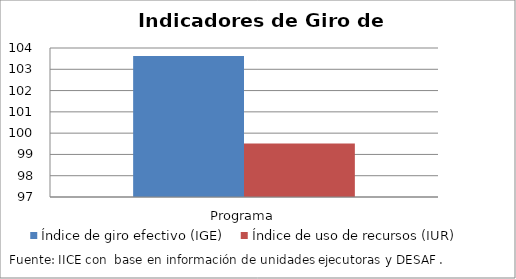
| Category | Índice de giro efectivo (IGE) | Índice de uso de recursos (IUR)  |
|---|---|---|
| Programa | 103.624 | 99.515 |